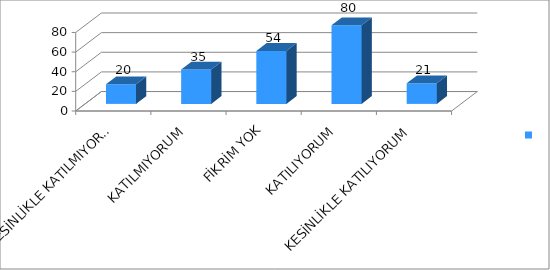
| Category | Series 0 |
|---|---|
| KESİNLİKLE KATILMIYORUM | 20 |
| KATILMIYORUM | 35 |
| FİKRİM YOK | 54 |
| KATILIYORUM | 80 |
| KESİNLİKLE KATILIYORUM | 21 |